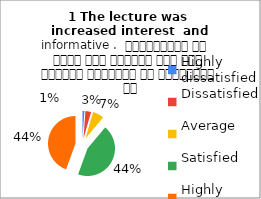
| Category | 1 The lecture was 
increased interest  and informative .  व्याख्यान से रुचि में वृद्धि हुई एवं शिक्षण जानकारी से परिपूर्ण था |
|---|---|
| Highly dissatisfied | 1 |
| Dissatisfied | 3 |
| Average | 6 |
| Satisfied | 40 |
| Highly satisfied | 40 |